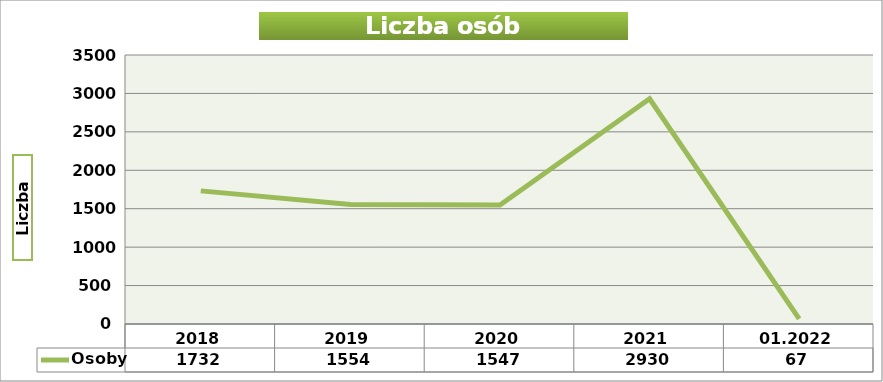
| Category | Osoby |
|---|---|
| 2018 | 1732 |
| 2019 | 1554 |
| 2020 | 1547 |
| 2021 | 2930 |
| 01.2022 | 67 |